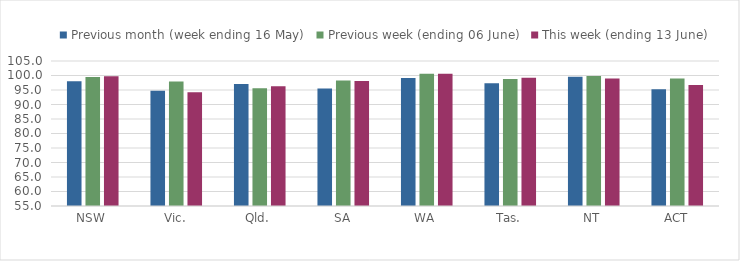
| Category | Previous month (week ending 16 May) | Previous week (ending 06 June) | This week (ending 13 June) |
|---|---|---|---|
| NSW | 98.048 | 99.519 | 99.718 |
| Vic. | 94.711 | 97.965 | 94.244 |
| Qld. | 97.071 | 95.6 | 96.322 |
| SA | 95.545 | 98.251 | 98.124 |
| WA | 99.12 | 100.612 | 100.593 |
| Tas. | 97.317 | 98.759 | 99.181 |
| NT | 99.542 | 99.794 | 98.924 |
| ACT | 95.239 | 98.957 | 96.7 |